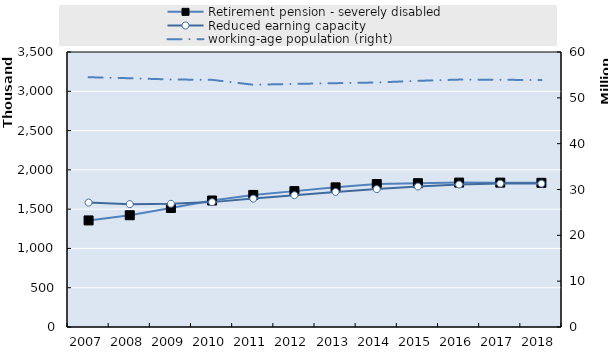
| Category | Retirement pension - severely disabled | Reduced earning capacity |
|---|---|---|
| 2007.0 | 1356271 | 1583801 |
| 2008.0 | 1422438 | 1563807 |
| 2009.0 | 1514474 | 1567841 |
| 2010.0 | 1609859 | 1589329 |
| 2011.0 | 1680843 | 1634126 |
| 2012.0 | 1729360 | 1677538 |
| 2013.0 | 1777289 | 1719346 |
| 2014.0 | 1819667 | 1755101 |
| 2015.0 | 1830537 | 1787854 |
| 2016.0 | 1837904 | 1813534 |
| 2017.0 | 1837421 | 1824913 |
| 2018.0 | 1835003 | 1824819 |